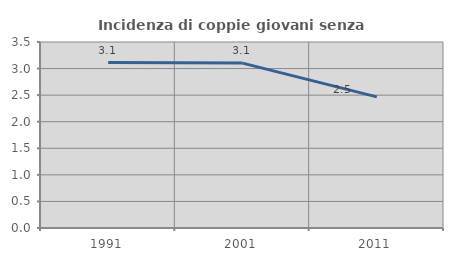
| Category | Incidenza di coppie giovani senza figli |
|---|---|
| 1991.0 | 3.112 |
| 2001.0 | 3.102 |
| 2011.0 | 2.467 |